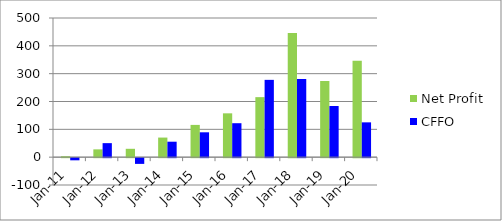
| Category | Net Profit | CFFO |
|---|---|---|
| 2020-03-31 | 346.49 | 125.09 |
| 2019-03-31 | 273.63 | 183.76 |
| 2018-03-31 | 446.47 | 280.93 |
| 2017-03-31 | 215.66 | 277.75 |
| 2016-03-31 | 157.5 | 122 |
| 2015-03-31 | 115.92 | 89.34 |
| 2014-03-31 | 70.41 | 55.56 |
| 2013-03-31 | 30.05 | -20.55 |
| 2012-03-31 | 28.05 | 50.38 |
| 2011-03-31 | 3.4 | -7.72 |